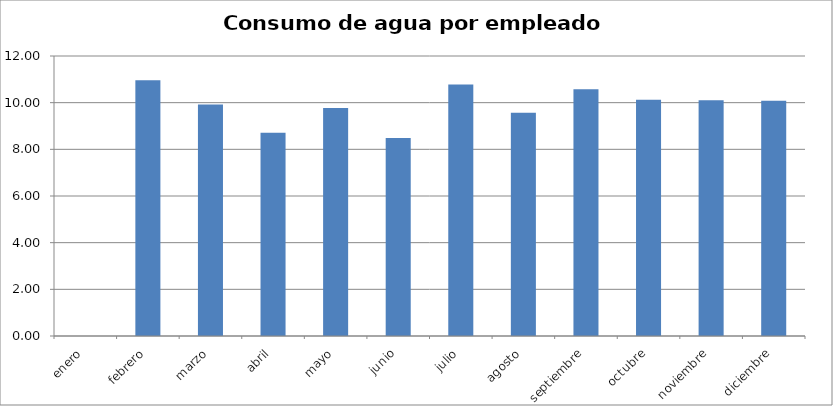
| Category | Series 0 |
|---|---|
| enero | 0 |
| febrero | 10.958 |
| marzo | 9.917 |
| abril | 8.708 |
| mayo | 9.771 |
| junio | 8.484 |
| julio | 10.776 |
| agosto | 9.568 |
| septiembre | 10.573 |
| octubre | 10.13 |
| noviembre | 10.099 |
| diciembre | 10.078 |